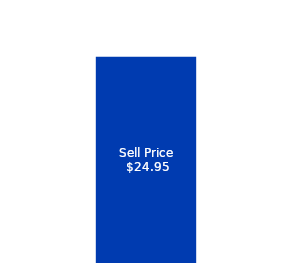
| Category | Sell Price |
|---|---|
| 0 | 24.95 |